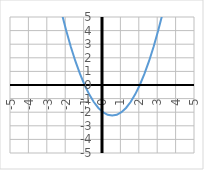
| Category | y |
|---|---|
| -5.0 | 28 |
| -4.75 | 25.312 |
| -4.5 | 22.75 |
| -4.25 | 20.312 |
| -4.0 | 18 |
| -3.75 | 15.812 |
| -3.5 | 13.75 |
| -3.25 | 11.812 |
| -3.0 | 10 |
| -2.75 | 8.312 |
| -2.5 | 6.75 |
| -2.25 | 5.312 |
| -2.0 | 4 |
| -1.75 | 2.812 |
| -1.5 | 1.75 |
| -1.25 | 0.812 |
| -1.0 | 0 |
| -0.75 | -0.688 |
| -0.5 | -1.25 |
| -0.25 | -1.688 |
| 0.0 | -2 |
| 0.25 | -2.188 |
| 0.5 | -2.25 |
| 0.75 | -2.188 |
| 1.0 | -2 |
| 1.25 | -1.688 |
| 1.5 | -1.25 |
| 1.75 | -0.688 |
| 2.0 | 0 |
| 2.25 | 0.812 |
| 2.5 | 1.75 |
| 2.75 | 2.812 |
| 3.0 | 4 |
| 3.25 | 5.312 |
| 3.5 | 6.75 |
| 3.75 | 8.312 |
| 4.0 | 10 |
| 4.25 | 11.812 |
| 4.5 | 13.75 |
| 4.75 | 15.812 |
| 5.0 | 18 |